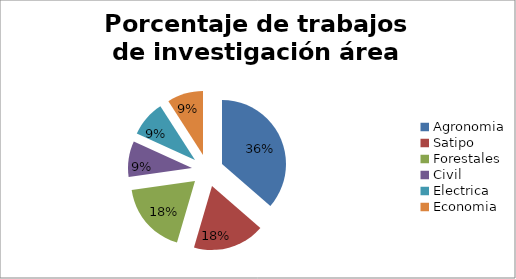
| Category | Nº |
|---|---|
| Agronomia | 4 |
| Satipo | 2 |
| Forestales | 2 |
| Civil | 1 |
| Electrica | 1 |
| Economia | 1 |